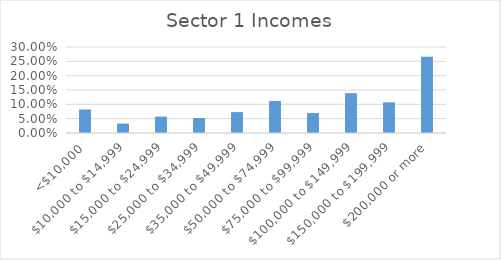
| Category | Series 0 |
|---|---|
| <$10,000 | 0.082 |
| $10,000 to $14,999 | 0.033 |
| $15,000 to $24,999 | 0.057 |
| $25,000 to $34,999 | 0.052 |
| $35,000 to $49,999 | 0.073 |
| $50,000 to $74,999 | 0.112 |
| $75,000 to $99,999 | 0.07 |
| $100,000 to $149,999 | 0.139 |
| $150,000 to $199,999 | 0.107 |
| $200,000 or more | 0.266 |